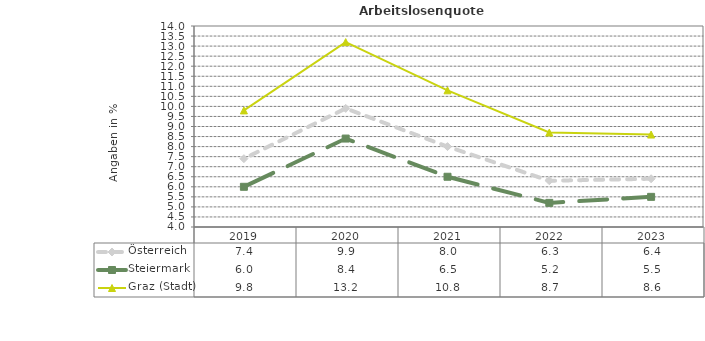
| Category | Österreich | Steiermark | Graz (Stadt) |
|---|---|---|---|
| 2023.0 | 6.4 | 5.5 | 8.6 |
| 2022.0 | 6.3 | 5.2 | 8.7 |
| 2021.0 | 8 | 6.5 | 10.8 |
| 2020.0 | 9.9 | 8.4 | 13.2 |
| 2019.0 | 7.4 | 6 | 9.8 |